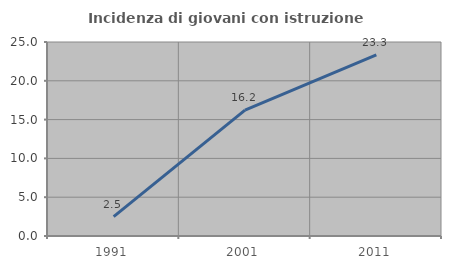
| Category | Incidenza di giovani con istruzione universitaria |
|---|---|
| 1991.0 | 2.5 |
| 2001.0 | 16.216 |
| 2011.0 | 23.333 |